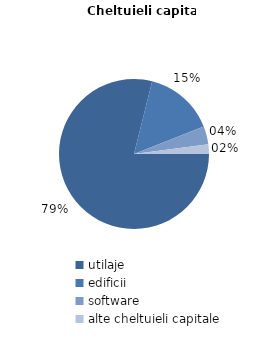
| Category | Series 0 |
|---|---|
| utilaje | 78.9 |
| edificii | 15.1 |
| software | 3.9 |
| alte cheltuieli capitale | 2.1 |